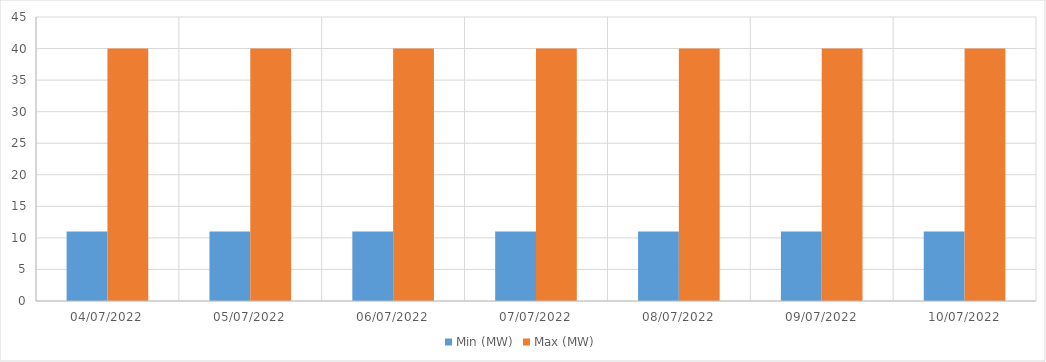
| Category | Min (MW) | Max (MW) |
|---|---|---|
| 04/07/2022 | 11 | 40 |
| 05/07/2022 | 11 | 40 |
| 06/07/2022 | 11 | 40 |
| 07/07/2022 | 11 | 40 |
| 08/07/2022 | 11 | 40 |
| 09/07/2022 | 11 | 40 |
| 10/07/2022 | 11 | 40 |